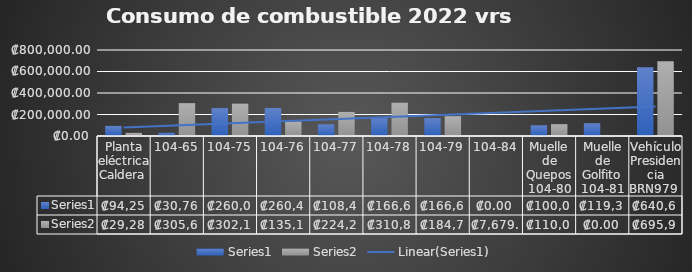
| Category | Series 0 | Series 1 |
|---|---|---|
| Planta eléctrica Caldera  | 94258 | 29283 |
| 104-65 | 30765 | 305616 |
| 104-75 | 260015 | 302138 |
| 104-76 | 260460 | 135166 |
| 104-77 | 108460 | 224250 |
| 104-78 | 166633 | 310876 |
| 104-79 | 166633 | 184742 |
| 104-84 | 0 | 7679 |
| Muelle de Quepos 104-80 | 100008 | 110015 |
| Muelle de Golfito 104-81 | 119385 | 0 |
| Vehículo Presidencia BRN979  | 640618 | 695988 |